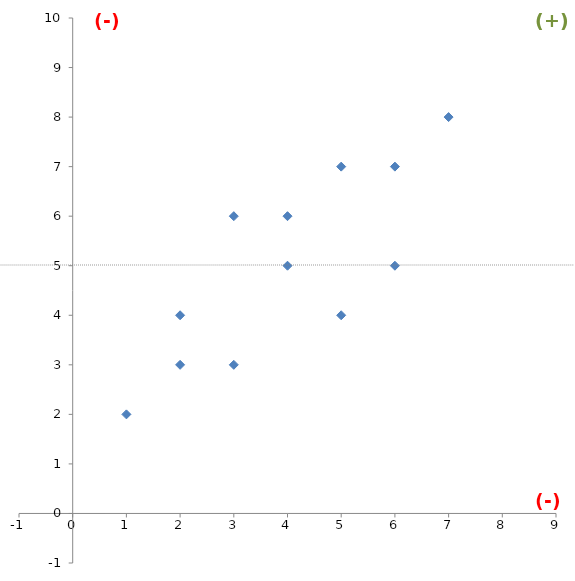
| Category | Series 0 |
|---|---|
| 3.0 | 3 |
| 3.0 | 6 |
| 5.0 | 7 |
| 6.0 | 7 |
| 5.0 | 4 |
| 6.0 | 5 |
| 7.0 | 8 |
| 4.0 | 6 |
| 2.0 | 4 |
| 4.0 | 5 |
| 1.0 | 2 |
| 2.0 | 3 |
| 48.0 | 60 |